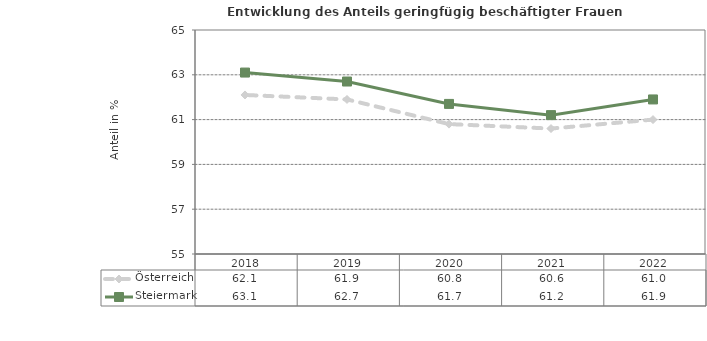
| Category | Österreich | Steiermark |
|---|---|---|
| 2022.0 | 61 | 61.9 |
| 2021.0 | 60.6 | 61.2 |
| 2020.0 | 60.8 | 61.7 |
| 2019.0 | 61.9 | 62.7 |
| 2018.0 | 62.1 | 63.1 |